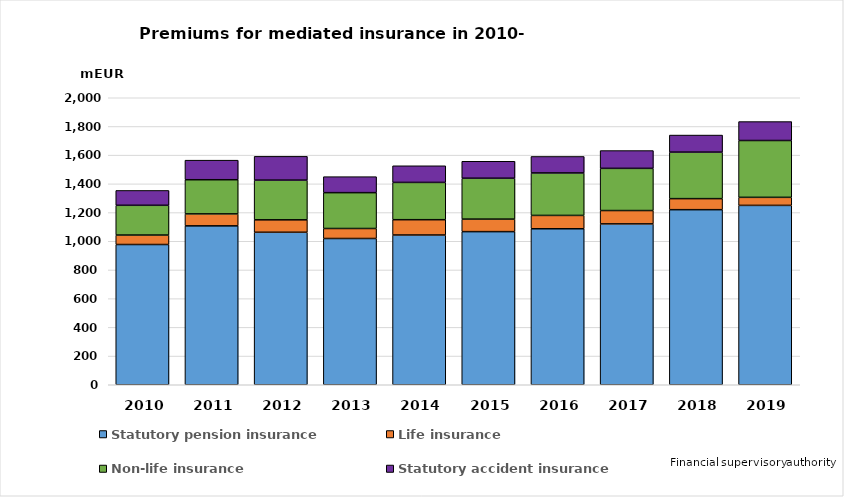
| Category | Statutory pension insurance | Life insurance | Non-life insurance | Statutory accident insurance |
|---|---|---|---|---|
| 2010.0 | 977.321 | 65.95 | 207.341 | 103.558 |
| 2011.0 | 1107.329 | 83.403 | 238.041 | 136.289 |
| 2012.0 | 1062.705 | 86.597 | 276.62 | 165.706 |
| 2013.0 | 1019.216 | 69.648 | 249.823 | 111.515 |
| 2014.0 | 1043.573 | 106.619 | 259.835 | 115.957 |
| 2015.0 | 1067.062 | 87.285 | 284.943 | 118.153 |
| 2016.0 | 1087 | 93 | 296 | 115 |
| 2017.0 | 1121 | 93 | 294 | 124 |
| 2018.0 | 1220 | 77 | 324 | 119 |
| 2019.0 | 1250 | 56 | 396 | 132 |